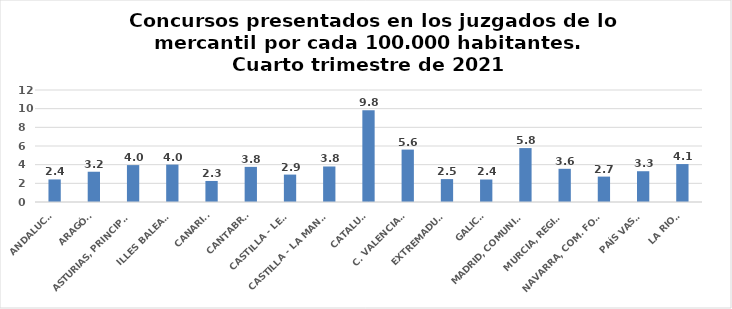
| Category | Series 0 |
|---|---|
| ANDALUCÍA | 2.418 |
| ARAGÓN | 3.242 |
| ASTURIAS, PRINCIPADO | 3.953 |
| ILLES BALEARS | 4.007 |
| CANARIAS | 2.255 |
| CANTABRIA | 3.764 |
| CASTILLA - LEÓN | 2.937 |
| CASTILLA - LA MANCHA | 3.806 |
| CATALUÑA | 9.841 |
| C. VALENCIANA | 5.615 |
| EXTREMADURA | 2.454 |
| GALICIA | 2.411 |
| MADRID, COMUNIDAD | 5.777 |
| MURCIA, REGIÓN | 3.556 |
| NAVARRA, COM. FORAL | 2.721 |
| PAÍS VASCO | 3.297 |
| LA RIOJA | 4.065 |